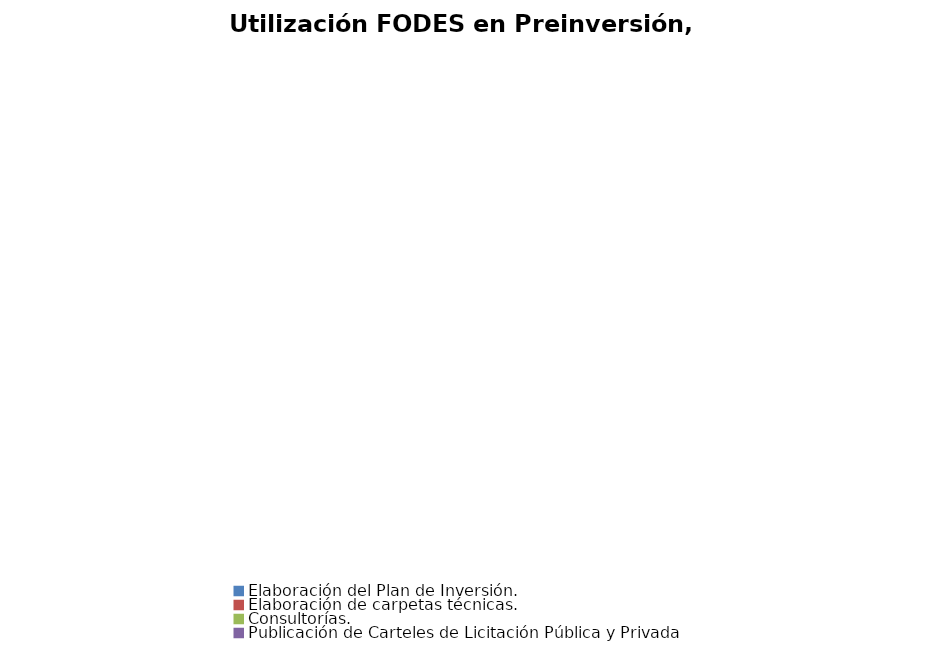
| Category | Series 0 |
|---|---|
| Elaboración del Plan de Inversión. | 0 |
| Elaboración de carpetas técnicas. | 0 |
| Consultorías. | 0 |
| Publicación de Carteles de Licitación Pública y Privada | 0 |